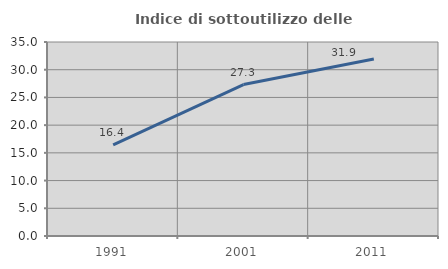
| Category | Indice di sottoutilizzo delle abitazioni  |
|---|---|
| 1991.0 | 16.446 |
| 2001.0 | 27.324 |
| 2011.0 | 31.933 |